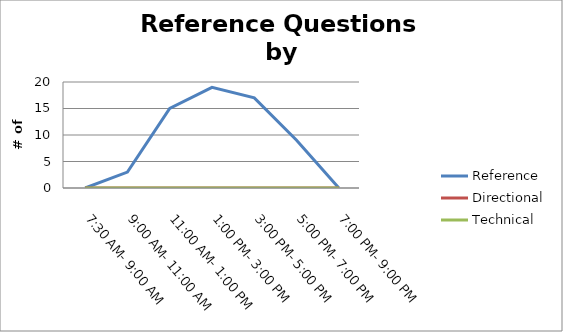
| Category | Reference | Directional | Technical |
|---|---|---|---|
| 7:30 AM- 9:00 AM | 0 | 0 | 0 |
| 9:00 AM- 11:00 AM | 3 | 0 | 0 |
| 11:00 AM- 1:00 PM | 15 | 0 | 0 |
| 1:00 PM- 3:00 PM | 19 | 0 | 0 |
| 3:00 PM- 5:00 PM | 17 | 0 | 0 |
| 5:00 PM- 7:00 PM | 9 | 0 | 0 |
| 7:00 PM- 9:00 PM | 0 | 0 | 0 |